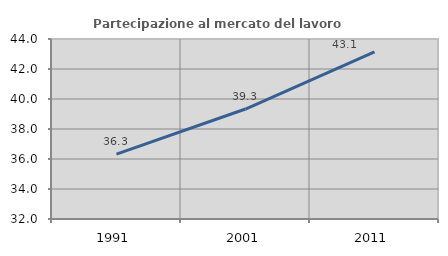
| Category | Partecipazione al mercato del lavoro  femminile |
|---|---|
| 1991.0 | 36.33 |
| 2001.0 | 39.333 |
| 2011.0 | 43.15 |